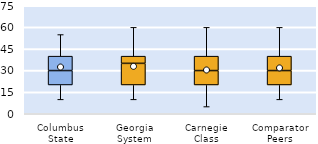
| Category | 25th | 50th | 75th |
|---|---|---|---|
| Columbus State | 20 | 10 | 10 |
| Georgia System | 20 | 15 | 5 |
| Carnegie Class | 20 | 10 | 10 |
| Comparator Peers | 20 | 10 | 10 |